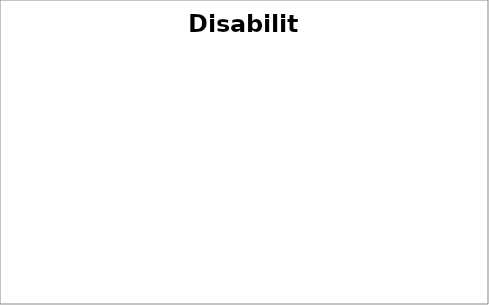
| Category | Series 0 |
|---|---|
| No Disability | 0 |
| Visual | 0 |
| Auditory | 0 |
| Speech | 0 |
| Mobility | 0 |
| Dyslexic | 0 |
| Other | 0 |
| Combination | 0 |
| Prefers not to say | 0 |
| Don't Know | 0 |